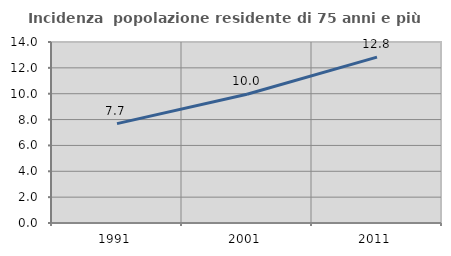
| Category | Incidenza  popolazione residente di 75 anni e più |
|---|---|
| 1991.0 | 7.685 |
| 2001.0 | 9.954 |
| 2011.0 | 12.834 |